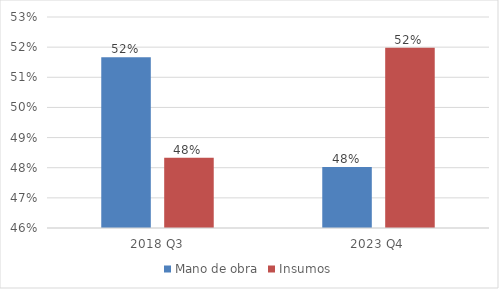
| Category | Mano de obra | Insumos |
|---|---|---|
| 2018 Q3 | 0.517 | 0.483 |
| 2023 Q4 | 0.48 | 0.52 |